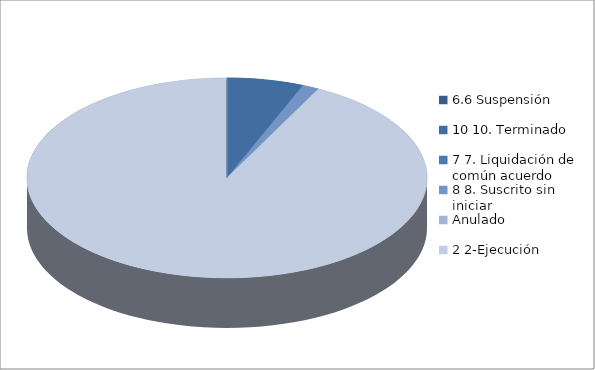
| Category | Series 0 |
|---|---|
| 6.6 Suspensión | 0 |
| 10 10. Terminado | 23 |
| 7 7. Liquidación de común acuerdo | 0 |
| 8 8. Suscrito sin iniciar | 5 |
| Anulado | 0 |
| 2 2-Ejecución | 343 |